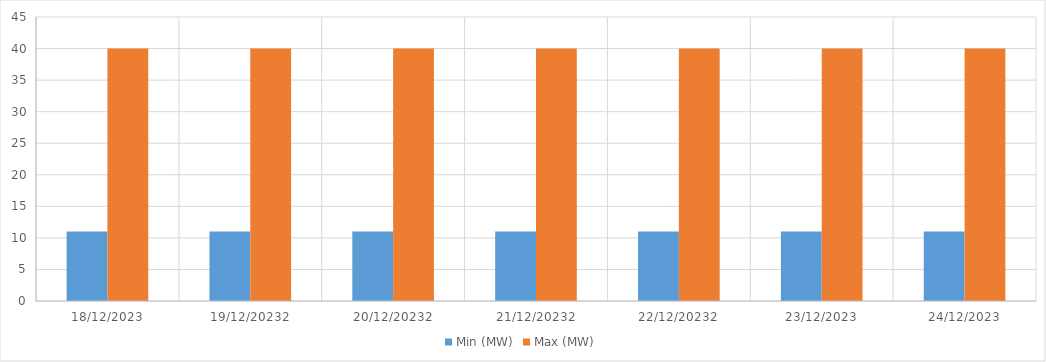
| Category | Min (MW) | Max (MW) |
|---|---|---|
| 18/12/2023 | 11 | 40 |
| 19/12/20232 | 11 | 40 |
| 20/12/20232 | 11 | 40 |
| 21/12/20232 | 11 | 40 |
| 22/12/20232 | 11 | 40 |
| 23/12/2023 | 11 | 40 |
| 24/12/2023 | 11 | 40 |